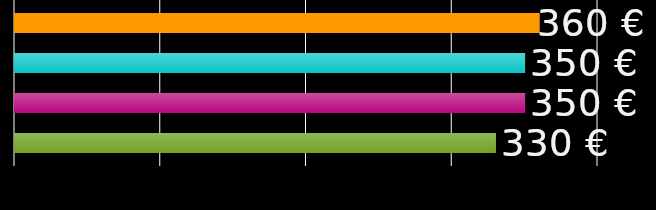
| Category | korterikaaslane 1 | korterikaaslane 2 | korterikaaslane 3 | korterikaaslane 4 |
|---|---|---|---|---|
| 0 | 360 | 350 | 350 | 330 |